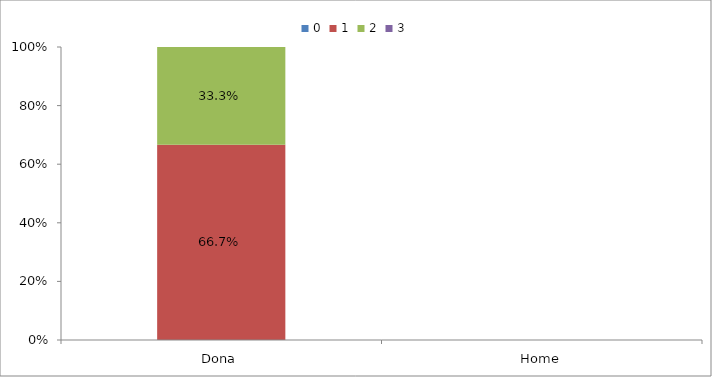
| Category | 0 | 1 | 2 | 3 |
|---|---|---|---|---|
| Dona | 0 | 0.667 | 0.333 | 0 |
| Home | 0 | 0 | 0 | 0 |